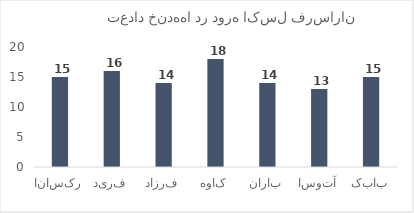
| Category | این هفته |
|---|---|
| رکسانا | 15 |
| فرید | 16 |
| فرزاد | 14 |
| کاوه | 18 |
| باران | 14 |
| آتوسا | 13 |
| بابک | 15 |